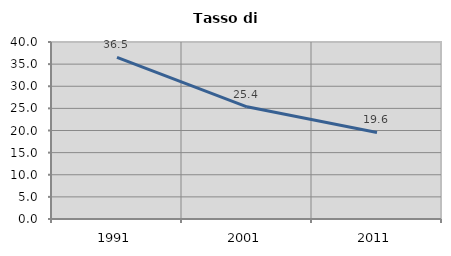
| Category | Tasso di disoccupazione   |
|---|---|
| 1991.0 | 36.526 |
| 2001.0 | 25.357 |
| 2011.0 | 19.562 |